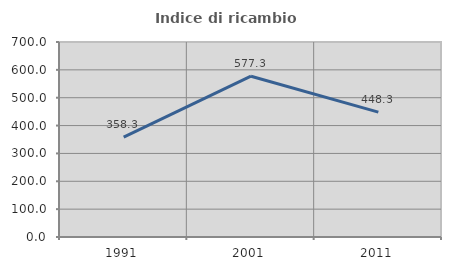
| Category | Indice di ricambio occupazionale  |
|---|---|
| 1991.0 | 358.333 |
| 2001.0 | 577.273 |
| 2011.0 | 448.276 |